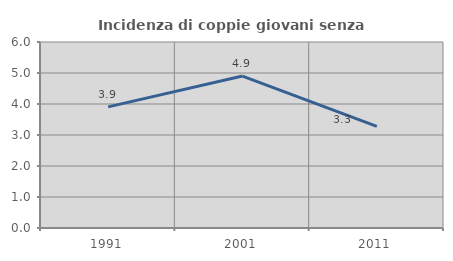
| Category | Incidenza di coppie giovani senza figli |
|---|---|
| 1991.0 | 3.907 |
| 2001.0 | 4.901 |
| 2011.0 | 3.279 |